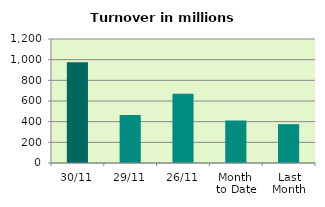
| Category | Series 0 |
|---|---|
| 30/11 | 974.069 |
| 29/11 | 463.759 |
| 26/11 | 669.126 |
| Month 
to Date | 410.338 |
| Last
Month | 375.959 |